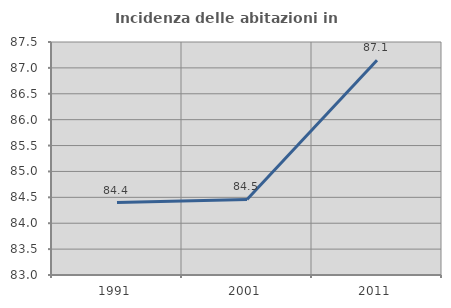
| Category | Incidenza delle abitazioni in proprietà  |
|---|---|
| 1991.0 | 84.4 |
| 2001.0 | 84.458 |
| 2011.0 | 87.148 |